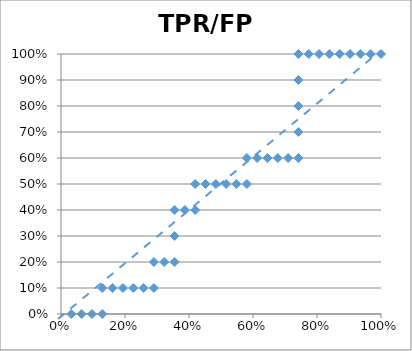
| Category | TPR |
|---|---|
| 0.03225806451612903 | 0 |
| 0.06451612903225806 | 0 |
| 0.0967741935483871 | 0 |
| 0.12903225806451613 | 0 |
| 0.12903225806451613 | 0.1 |
| 0.16129032258064516 | 0.1 |
| 0.1935483870967742 | 0.1 |
| 0.22580645161290322 | 0.1 |
| 0.25806451612903225 | 0.1 |
| 0.2903225806451613 | 0.1 |
| 0.2903225806451613 | 0.2 |
| 0.3225806451612903 | 0.2 |
| 0.3548387096774194 | 0.2 |
| 0.3548387096774194 | 0.3 |
| 0.3548387096774194 | 0.4 |
| 0.3870967741935484 | 0.4 |
| 0.41935483870967744 | 0.4 |
| 0.41935483870967744 | 0.5 |
| 0.45161290322580644 | 0.5 |
| 0.4838709677419355 | 0.5 |
| 0.5161290322580645 | 0.5 |
| 0.5483870967741935 | 0.5 |
| 0.5806451612903226 | 0.5 |
| 0.5806451612903226 | 0.6 |
| 0.6129032258064516 | 0.6 |
| 0.6451612903225806 | 0.6 |
| 0.6774193548387096 | 0.6 |
| 0.7096774193548387 | 0.6 |
| 0.7419354838709677 | 0.6 |
| 0.7419354838709677 | 0.7 |
| 0.7419354838709677 | 0.8 |
| 0.7419354838709677 | 0.9 |
| 0.7419354838709677 | 1 |
| 0.7741935483870968 | 1 |
| 0.8064516129032258 | 1 |
| 0.8387096774193549 | 1 |
| 0.8709677419354839 | 1 |
| 0.9032258064516129 | 1 |
| 0.9354838709677419 | 1 |
| 0.967741935483871 | 1 |
| 1.0 | 1 |